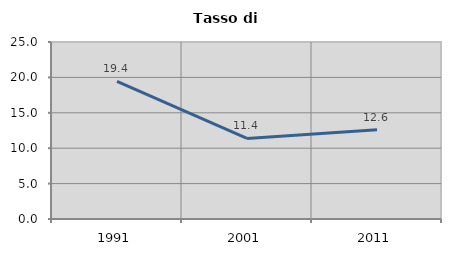
| Category | Tasso di disoccupazione   |
|---|---|
| 1991.0 | 19.439 |
| 2001.0 | 11.372 |
| 2011.0 | 12.615 |